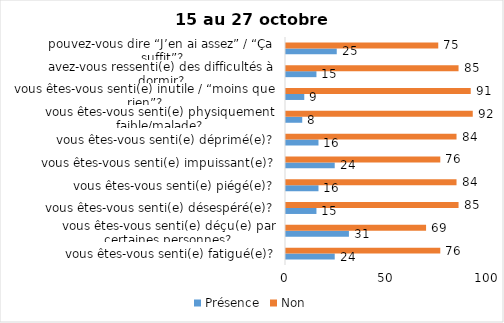
| Category | Présence | Non |
|---|---|---|
| vous êtes-vous senti(e) fatigué(e)? | 24 | 76 |
| vous êtes-vous senti(e) déçu(e) par certaines personnes? | 31 | 69 |
| vous êtes-vous senti(e) désespéré(e)? | 15 | 85 |
| vous êtes-vous senti(e) piégé(e)? | 16 | 84 |
| vous êtes-vous senti(e) impuissant(e)? | 24 | 76 |
| vous êtes-vous senti(e) déprimé(e)? | 16 | 84 |
| vous êtes-vous senti(e) physiquement faible/malade? | 8 | 92 |
| vous êtes-vous senti(e) inutile / “moins que rien”? | 9 | 91 |
| avez-vous ressenti(e) des difficultés à dormir? | 15 | 85 |
| pouvez-vous dire “J’en ai assez” / “Ça suffit”? | 25 | 75 |